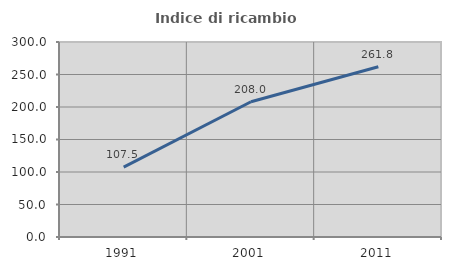
| Category | Indice di ricambio occupazionale  |
|---|---|
| 1991.0 | 107.5 |
| 2001.0 | 208.036 |
| 2011.0 | 261.836 |